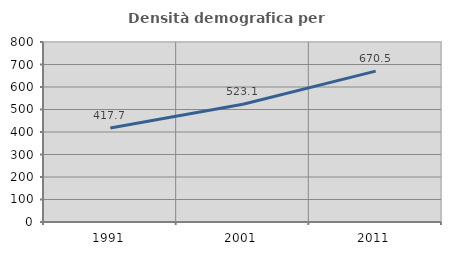
| Category | Densità demografica |
|---|---|
| 1991.0 | 417.704 |
| 2001.0 | 523.144 |
| 2011.0 | 670.49 |